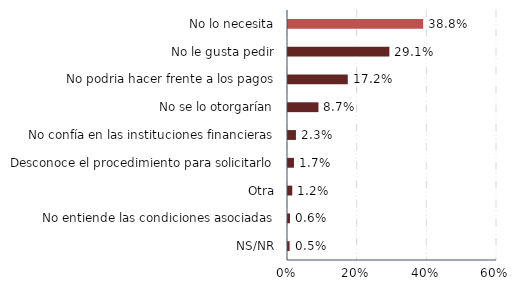
| Category | % |
|---|---|
| NS/NR | 0.005 |
| No entiende las condiciones asociadas | 0.006 |
| Otra | 0.012 |
| Desconoce el procedimiento para solicitarlo | 0.017 |
| No confía en las instituciones financieras | 0.023 |
| No se lo otorgarían | 0.087 |
| No podria hacer frente a los pagos | 0.172 |
| No le gusta pedir | 0.291 |
| No lo necesita | 0.388 |